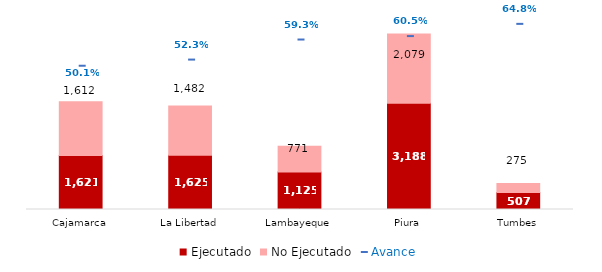
| Category | Ejecutado | No Ejecutado |
|---|---|---|
| Cajamarca | 1620.717 | 1611.617 |
| La Libertad | 1624.727 | 1481.988 |
| Lambayeque | 1124.669 | 771.382 |
| Piura | 3187.522 | 2079.422 |
| Tumbes | 506.671 | 275.273 |